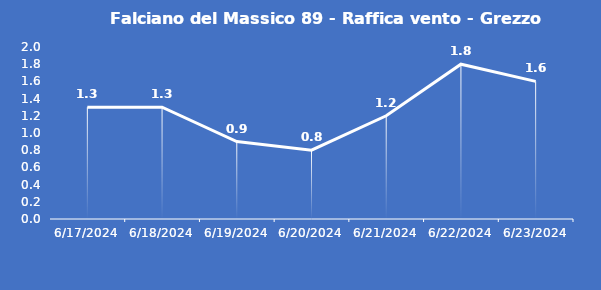
| Category | Falciano del Massico 89 - Raffica vento - Grezzo (m/s) |
|---|---|
| 6/17/24 | 1.3 |
| 6/18/24 | 1.3 |
| 6/19/24 | 0.9 |
| 6/20/24 | 0.8 |
| 6/21/24 | 1.2 |
| 6/22/24 | 1.8 |
| 6/23/24 | 1.6 |